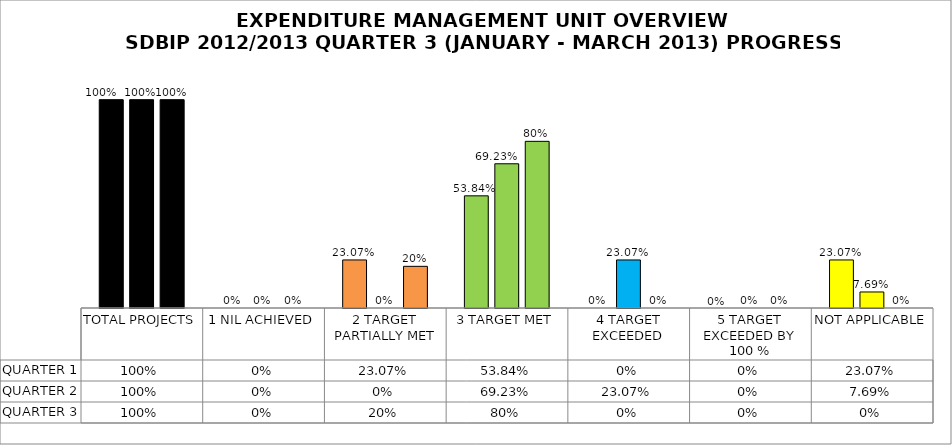
| Category | QUARTER 1 | QUARTER 2 | QUARTER 3 |
|---|---|---|---|
| TOTAL PROJECTS | 1 | 1 | 1 |
| 1 NIL ACHIEVED | 0 | 0 | 0 |
| 2 TARGET PARTIALLY MET | 0.231 | 0 | 0.2 |
| 3 TARGET MET | 0.538 | 0.692 | 0.8 |
| 4 TARGET EXCEEDED | 0 | 0.231 | 0 |
| 5 TARGET EXCEEDED BY 100 % | 0 | 0 | 0 |
| NOT APPLICABLE | 0.231 | 0.077 | 0 |